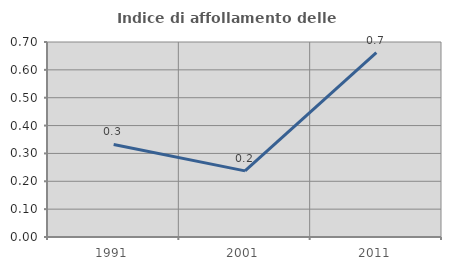
| Category | Indice di affollamento delle abitazioni  |
|---|---|
| 1991.0 | 0.332 |
| 2001.0 | 0.237 |
| 2011.0 | 0.662 |